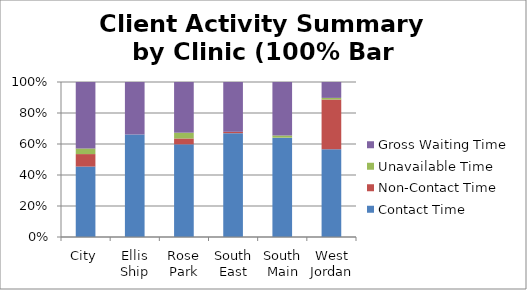
| Category | Contact Time | Non-Contact Time | Unavailable Time | Gross Waiting Time |
|---|---|---|---|---|
| City | 26.61 | 4.71 | 2.13 | 25.1 |
| Ellis Ship | 25.28 | 0 | 0 | 12.91 |
| Rose Park | 25.25 | 1.6 | 1.58 | 13.81 |
| South East | 25.99 | 0.34 | 0 | 12.47 |
| South Main | 26.41 | 0 | 0.58 | 14.22 |
| West Jordan | 30.19 | 17.17 | 0.56 | 5.47 |